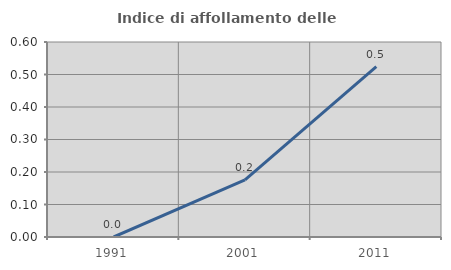
| Category | Indice di affollamento delle abitazioni  |
|---|---|
| 1991.0 | 0 |
| 2001.0 | 0.176 |
| 2011.0 | 0.524 |